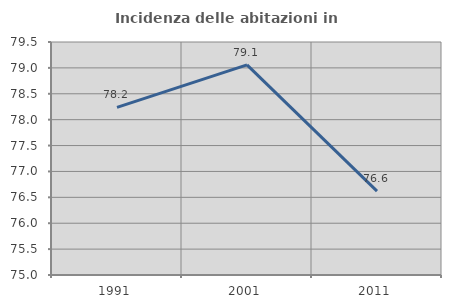
| Category | Incidenza delle abitazioni in proprietà  |
|---|---|
| 1991.0 | 78.236 |
| 2001.0 | 79.057 |
| 2011.0 | 76.619 |